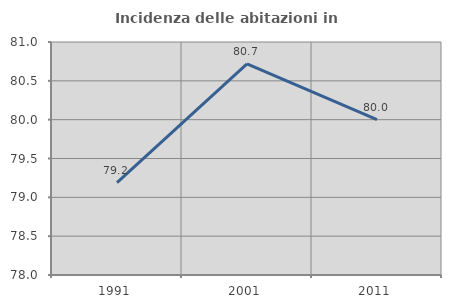
| Category | Incidenza delle abitazioni in proprietà  |
|---|---|
| 1991.0 | 79.189 |
| 2001.0 | 80.717 |
| 2011.0 | 80 |